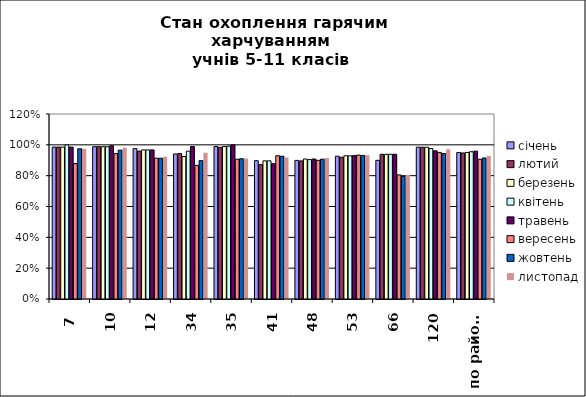
| Category | січень | лютий | березень | квітень | травень | вересень | жовтень | листопад |
|---|---|---|---|---|---|---|---|---|
| 7 | 0.985 | 0.985 | 0.985 | 1 | 0.985 | 0.878 | 0.974 | 0.975 |
| 10 | 0.988 | 0.988 | 0.988 | 0.988 | 0.994 | 0.943 | 0.965 | 0.981 |
| 12 | 0.975 | 0.959 | 0.967 | 0.967 | 0.967 | 0.913 | 0.913 | 0.923 |
| 34 | 0.941 | 0.943 | 0.924 | 0.959 | 0.989 | 0.867 | 0.897 | 0.949 |
| 35 | 0.989 | 0.984 | 0.989 | 0.992 | 1 | 0.906 | 0.91 | 0.912 |
| 41 | 0.897 | 0.872 | 0.896 | 0.896 | 0.877 | 0.929 | 0.926 | 0.917 |
| 48 | 0.899 | 0.896 | 0.908 | 0.904 | 0.908 | 0.9 | 0.907 | 0.914 |
| 53 | 0.926 | 0.919 | 0.929 | 0.929 | 0.93 | 0.934 | 0.931 | 0.933 |
| 66 | 0.9 | 0.939 | 0.939 | 0.939 | 0.939 | 0.805 | 0.795 | 0.805 |
| 120 | 0.985 | 0.984 | 0.984 | 0.976 | 0.961 | 0.951 | 0.944 | 0.971 |
| по району | 0.95 | 0.947 | 0.951 | 0.955 | 0.959 | 0.906 | 0.915 | 0.927 |